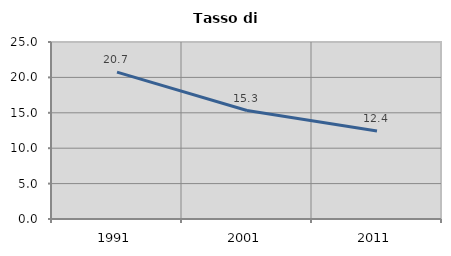
| Category | Tasso di disoccupazione   |
|---|---|
| 1991.0 | 20.741 |
| 2001.0 | 15.318 |
| 2011.0 | 12.444 |